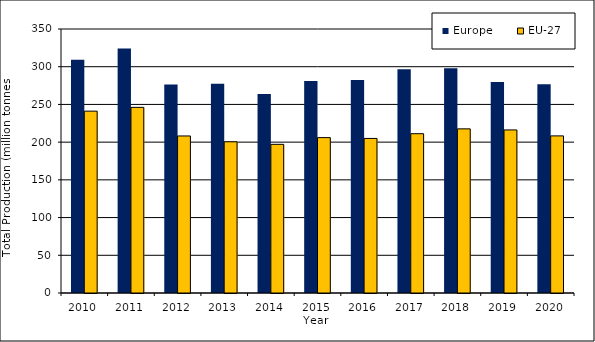
| Category | Europe  | EU-27 |
|---|---|---|
| 2010.0 | 309.3 | 241.1 |
| 2011.0 | 324.3 | 246.1 |
| 2012.0 | 276.4 | 208.2 |
| 2013.0 | 277.3 | 200.5 |
| 2014.0 | 263.7 | 197.1 |
| 2015.0 | 280.9 | 206 |
| 2016.0 | 282.5 | 204.9 |
| 2017.0 | 296.7 | 211.2 |
| 2018.0 | 297.9 | 217.6 |
| 2019.0 | 279.7 | 216.2 |
| 2020.0 | 276.9 | 208.3 |